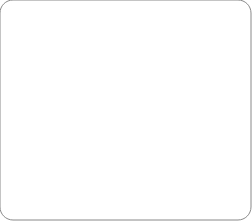
| Category | Series 0 |
|---|---|
| Weizen | 0 |
| Mais | 0 |
| Raps | 0 |
| Baumwolle | 0 |